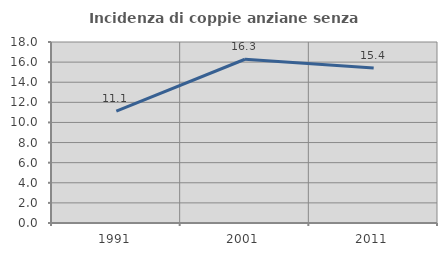
| Category | Incidenza di coppie anziane senza figli  |
|---|---|
| 1991.0 | 11.124 |
| 2001.0 | 16.285 |
| 2011.0 | 15.404 |